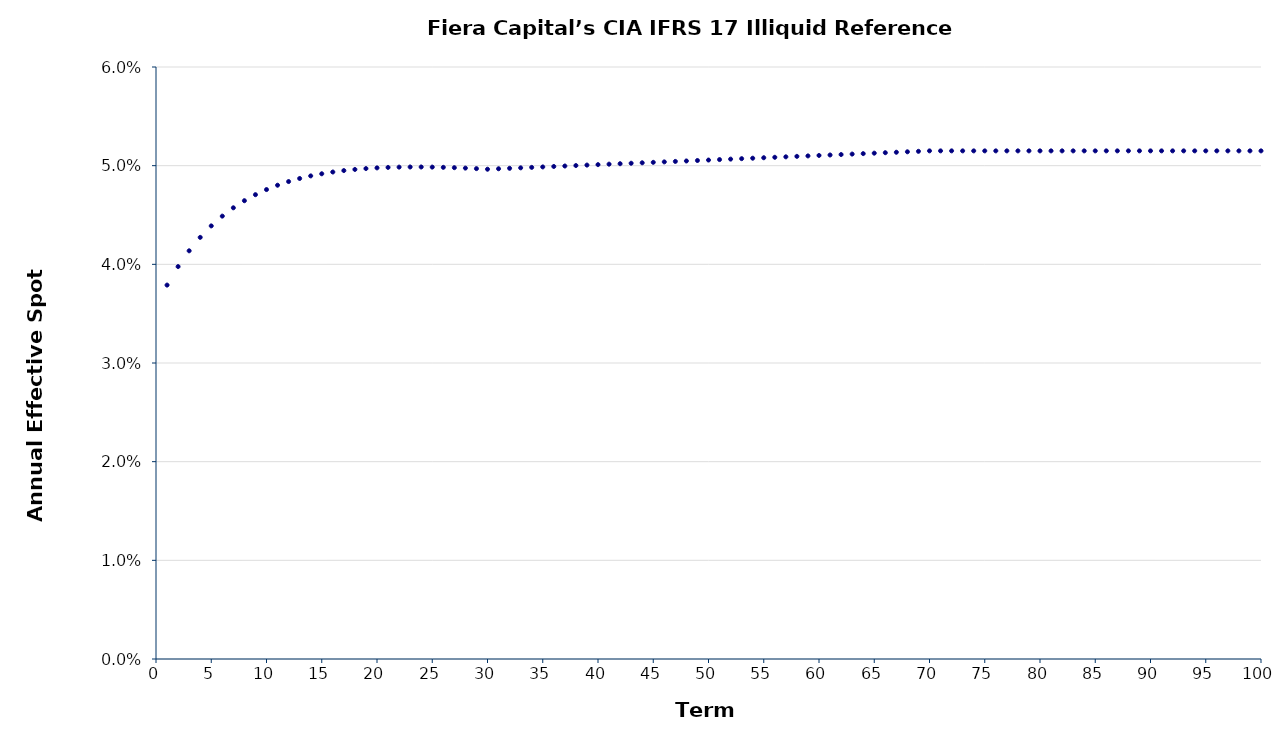
| Category | Annual Effective Spot Rate |
|---|---|
| 1.0 | 0.038 |
| 2.0 | 0.04 |
| 3.0 | 0.041 |
| 4.0 | 0.043 |
| 5.0 | 0.044 |
| 6.0 | 0.045 |
| 7.0 | 0.046 |
| 8.0 | 0.046 |
| 9.0 | 0.047 |
| 10.0 | 0.048 |
| 11.0 | 0.048 |
| 12.0 | 0.048 |
| 13.0 | 0.049 |
| 14.0 | 0.049 |
| 15.0 | 0.049 |
| 16.0 | 0.049 |
| 17.0 | 0.05 |
| 18.0 | 0.05 |
| 19.0 | 0.05 |
| 20.0 | 0.05 |
| 21.0 | 0.05 |
| 22.0 | 0.05 |
| 23.0 | 0.05 |
| 24.0 | 0.05 |
| 25.0 | 0.05 |
| 26.0 | 0.05 |
| 27.0 | 0.05 |
| 28.0 | 0.05 |
| 29.0 | 0.05 |
| 30.0 | 0.05 |
| 31.0 | 0.05 |
| 32.0 | 0.05 |
| 33.0 | 0.05 |
| 34.0 | 0.05 |
| 35.0 | 0.05 |
| 36.0 | 0.05 |
| 37.0 | 0.05 |
| 38.0 | 0.05 |
| 39.0 | 0.05 |
| 40.0 | 0.05 |
| 41.0 | 0.05 |
| 42.0 | 0.05 |
| 43.0 | 0.05 |
| 44.0 | 0.05 |
| 45.0 | 0.05 |
| 46.0 | 0.05 |
| 47.0 | 0.05 |
| 48.0 | 0.05 |
| 49.0 | 0.051 |
| 50.0 | 0.051 |
| 51.0 | 0.051 |
| 52.0 | 0.051 |
| 53.0 | 0.051 |
| 54.0 | 0.051 |
| 55.0 | 0.051 |
| 56.0 | 0.051 |
| 57.0 | 0.051 |
| 58.0 | 0.051 |
| 59.0 | 0.051 |
| 60.0 | 0.051 |
| 61.0 | 0.051 |
| 62.0 | 0.051 |
| 63.0 | 0.051 |
| 64.0 | 0.051 |
| 65.0 | 0.051 |
| 66.0 | 0.051 |
| 67.0 | 0.051 |
| 68.0 | 0.051 |
| 69.0 | 0.051 |
| 70.0 | 0.052 |
| 71.0 | 0.052 |
| 72.0 | 0.052 |
| 73.0 | 0.052 |
| 74.0 | 0.052 |
| 75.0 | 0.052 |
| 76.0 | 0.052 |
| 77.0 | 0.052 |
| 78.0 | 0.052 |
| 79.0 | 0.052 |
| 80.0 | 0.052 |
| 81.0 | 0.052 |
| 82.0 | 0.052 |
| 83.0 | 0.052 |
| 84.0 | 0.052 |
| 85.0 | 0.052 |
| 86.0 | 0.052 |
| 87.0 | 0.052 |
| 88.0 | 0.052 |
| 89.0 | 0.052 |
| 90.0 | 0.052 |
| 91.0 | 0.052 |
| 92.0 | 0.052 |
| 93.0 | 0.052 |
| 94.0 | 0.052 |
| 95.0 | 0.052 |
| 96.0 | 0.052 |
| 97.0 | 0.052 |
| 98.0 | 0.052 |
| 99.0 | 0.052 |
| 100.0 | 0.052 |